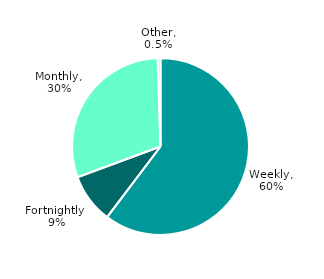
| Category | Series 0 |
|---|---|
| Weekly | 0.6 |
| Fortnightly | 0.09 |
| Monthly | 0.3 |
| Other | 0.005 |